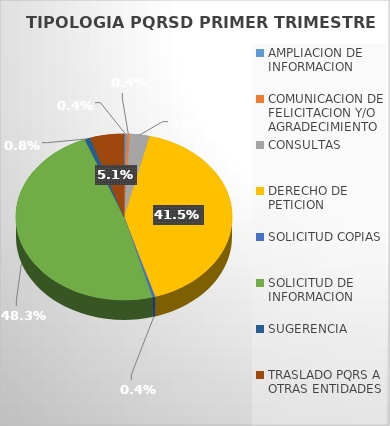
| Category | CANTIDAD |
|---|---|
| AMPLIACION DE INFORMACION | 1 |
| COMUNICACION DE FELICITACION Y/O AGRADECIMIENTO | 1 |
| CONSULTAS | 7 |
| DERECHO DE PETICION | 98 |
| SOLICITUD COPIAS | 1 |
| SOLICITUD DE INFORMACION | 114 |
| SUGERENCIA | 2 |
| TRASLADO PQRS A OTRAS ENTIDADES | 12 |